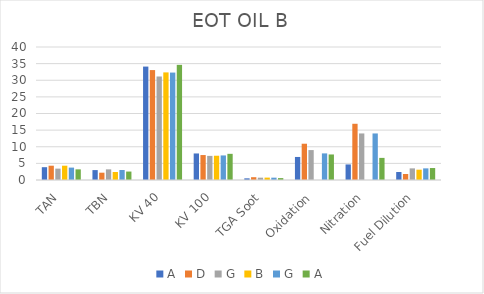
| Category | A | D | G | B |
|---|---|---|---|---|
| TAN | 3.2 | 4.3 | 3.73 | 4.3 |
| TBN | 2.54 | 2.2 | 3 | 2.4 |
| KV 40 | 34.63 | 33.06 | 32.31 | 32.36 |
| KV 100 | 7.87 | 7.505 | 7.39 | 7.3 |
| TGA Soot | 0.572 | 0.843 | 0.7 | 0.72 |
| Oxidation | 7.68 | 10.91 | 8 | 0 |
| Nitration | 6.65 | 16.91 | 14 | 0 |
| Fuel Dilution | 3.6 | 1.8 | 3.5 | 3.1 |